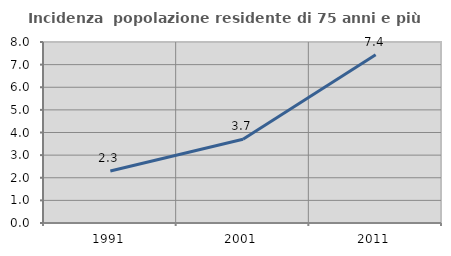
| Category | Incidenza  popolazione residente di 75 anni e più |
|---|---|
| 1991.0 | 2.299 |
| 2001.0 | 3.704 |
| 2011.0 | 7.441 |